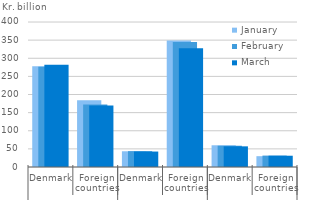
| Category | January | February | March |
|---|---|---|---|
| 0 | 277858752478 | 276642526968 | 282176597453 |
| 1 | 184109085707.205 | 172526996245.41 | 169315440413.77 |
| 2 | 43396286022 | 43643817689 | 42630048693 |
| 3 | 349164173462 | 344575117370 | 327914918626 |
| 4 | 59923995015 | 58693785676 | 56975164362 |
| 5 | 29861813209 | 31491128661 | 31105288304 |